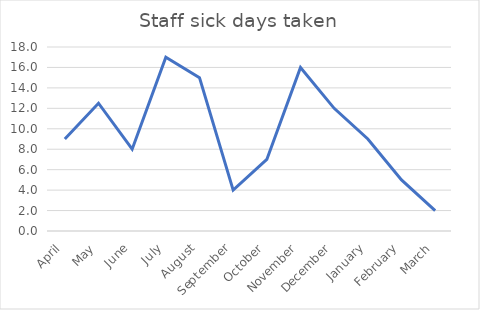
| Category | KPI2 eg staff sick days taken |
|---|---|
| April | 9 |
| May | 12.5 |
| June | 8 |
| July | 17 |
| August | 15 |
| September | 4 |
| October | 7 |
| November | 16 |
| December | 12 |
| January | 9 |
| February | 5 |
| March | 2 |